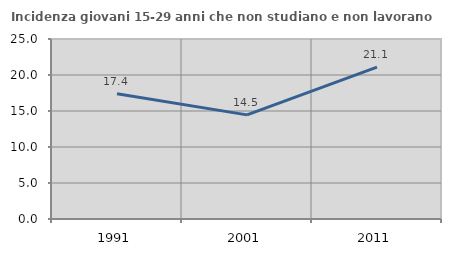
| Category | Incidenza giovani 15-29 anni che non studiano e non lavorano  |
|---|---|
| 1991.0 | 17.385 |
| 2001.0 | 14.463 |
| 2011.0 | 21.097 |